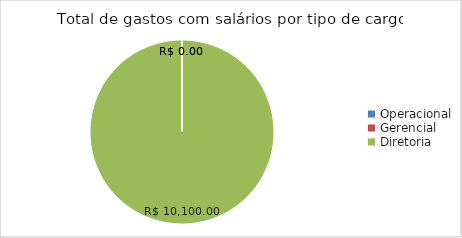
| Category | Total de salários |
|---|---|
| Operacional | 0 |
| Gerencial | 0 |
| Diretoria | 10100 |